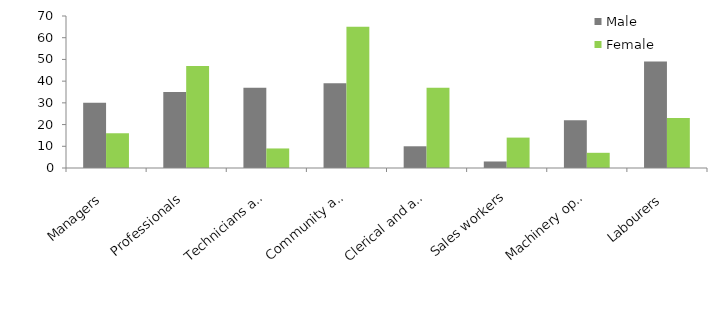
| Category | Male | Female |
|---|---|---|
| Managers | 30 | 16 |
| Professionals | 35 | 47 |
| Technicians and trades workers | 37 | 9 |
| Community and personal service workers | 39 | 65 |
| Clerical and administrative workers | 10 | 37 |
| Sales workers | 3 | 14 |
| Machinery operators and drivers | 22 | 7 |
| Labourers | 49 | 23 |